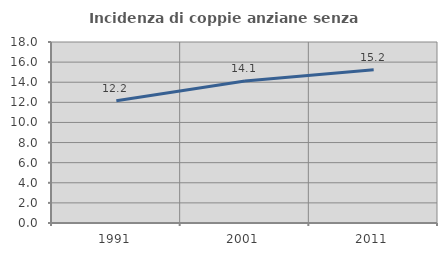
| Category | Incidenza di coppie anziane senza figli  |
|---|---|
| 1991.0 | 12.151 |
| 2001.0 | 14.127 |
| 2011.0 | 15.249 |